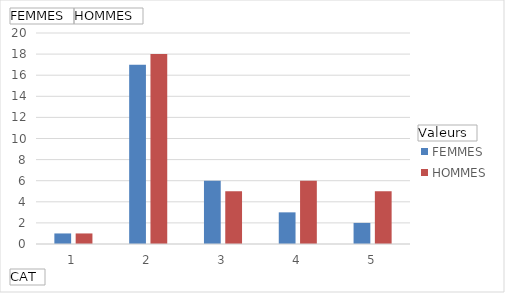
| Category | FEMMES | HOMMES |
|---|---|---|
| 1 | 1 | 1 |
| 2 | 17 | 18 |
| 3 | 6 | 5 |
| 4 | 3 | 6 |
| 5 | 2 | 5 |